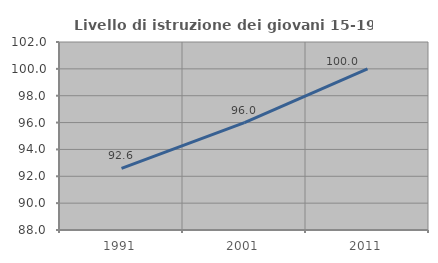
| Category | Livello di istruzione dei giovani 15-19 anni |
|---|---|
| 1991.0 | 92.593 |
| 2001.0 | 96 |
| 2011.0 | 100 |